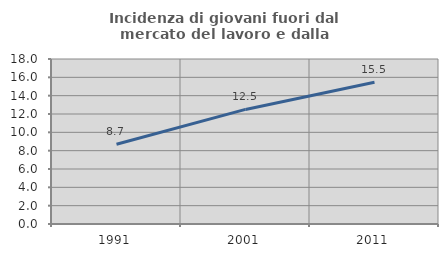
| Category | Incidenza di giovani fuori dal mercato del lavoro e dalla formazione  |
|---|---|
| 1991.0 | 8.696 |
| 2001.0 | 12.5 |
| 2011.0 | 15.455 |